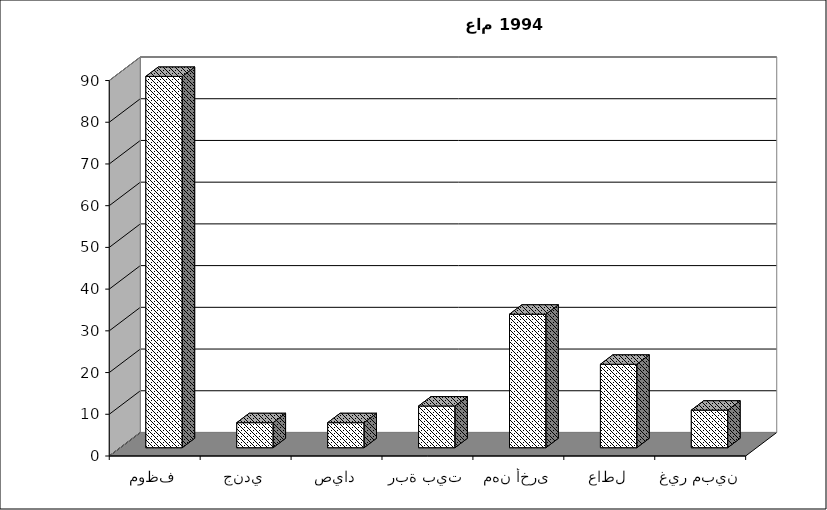
| Category | Series 0 |
|---|---|
| موظف | 89 |
| جندي | 6 |
| صياد | 6 |
| ربة بيت | 10 |
| مهن أخرى | 32 |
| عاطل | 20 |
| غير مبين | 9 |